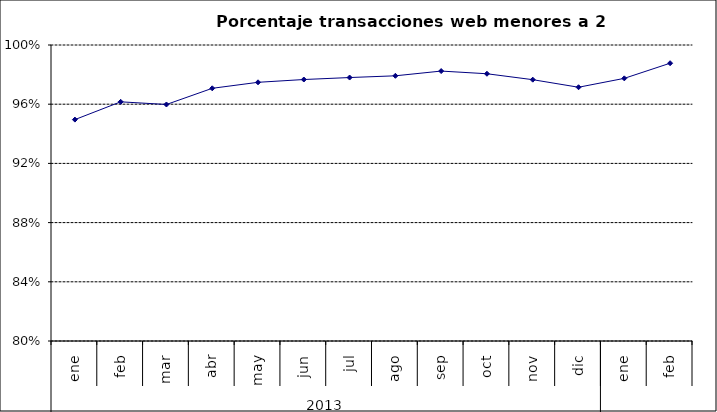
| Category | 94,96% 96,16% 95,98% 97,07% 97,48% 97,67% 97,80% 97,92% 98,24% 98,06% 97,66% 97,15% 97,75% 98,77% |
|---|---|
| 0 | 0.95 |
| 1 | 0.962 |
| 2 | 0.96 |
| 3 | 0.971 |
| 4 | 0.975 |
| 5 | 0.977 |
| 6 | 0.978 |
| 7 | 0.979 |
| 8 | 0.982 |
| 9 | 0.981 |
| 10 | 0.977 |
| 11 | 0.971 |
| 12 | 0.977 |
| 13 | 0.988 |